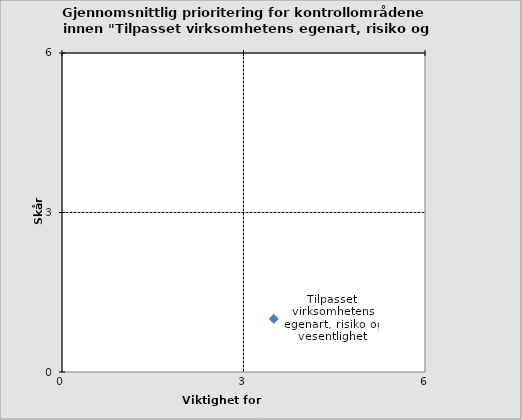
| Category | Tilpasset virksomhetens egenart, risiko og vesentlighet |
|---|---|
| 3.5 | 1 |